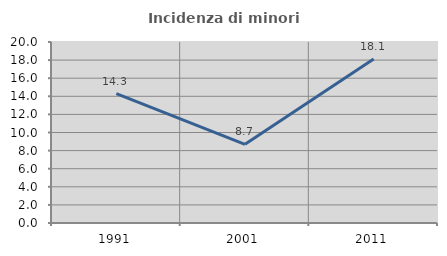
| Category | Incidenza di minori stranieri |
|---|---|
| 1991.0 | 14.286 |
| 2001.0 | 8.696 |
| 2011.0 | 18.125 |